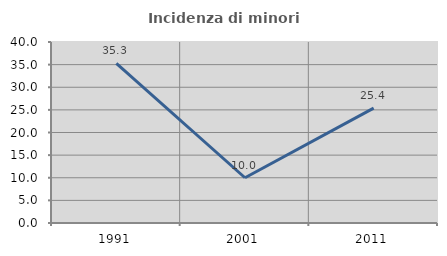
| Category | Incidenza di minori stranieri |
|---|---|
| 1991.0 | 35.294 |
| 2001.0 | 10 |
| 2011.0 | 25.373 |